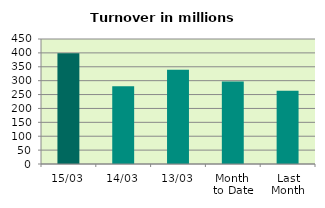
| Category | Series 0 |
|---|---|
| 15/03 | 398.806 |
| 14/03 | 280.138 |
| 13/03 | 339.511 |
| Month 
to Date | 296.657 |
| Last
Month | 263.32 |